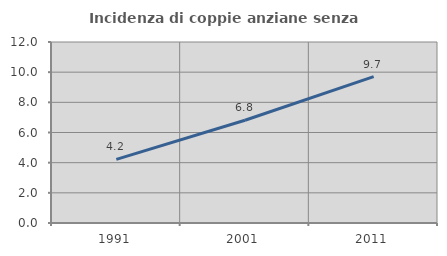
| Category | Incidenza di coppie anziane senza figli  |
|---|---|
| 1991.0 | 4.222 |
| 2001.0 | 6.815 |
| 2011.0 | 9.701 |